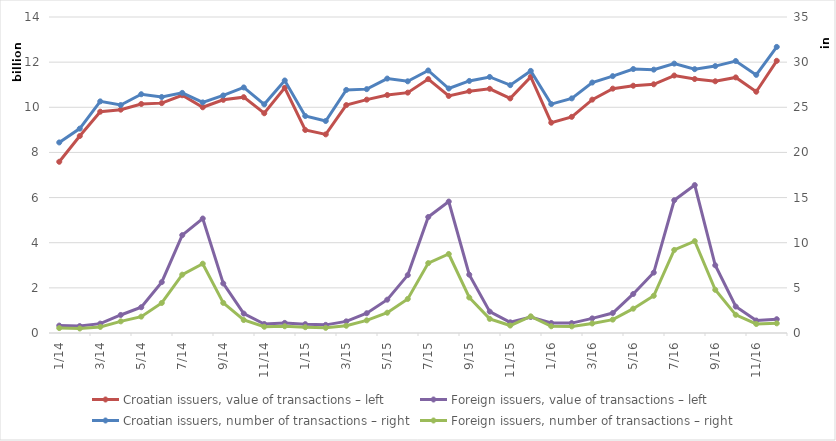
| Category | Croatian issuers, value of transactions – left | Foreign issuers, value of transactions – left |
|---|---|---|
| 2014-01-01 | 7585840375 | 328201810 |
| 2014-02-01 | 8725526927 | 306395645 |
| 2014-03-01 | 9804662078 | 415570803 |
| 2014-04-01 | 9894648498 | 798582111 |
| 2014-05-01 | 10147293016 | 1142027280 |
| 2014-06-01 | 10184003798 | 2253138744 |
| 2014-07-01 | 10533646343 | 4336828548 |
| 2014-08-01 | 10000321273 | 5071737877 |
| 2014-09-01 | 10330312901 | 2195141284 |
| 2014-10-01 | 10447253094 | 859794628 |
| 2014-11-01 | 9735255380 | 398467769 |
| 2014-12-01 | 10859944205 | 447230458 |
| 2015-01-01 | 8994025271 | 392887043 |
| 2015-02-01 | 8800036174 | 360578001 |
| 2015-03-01 | 10097058766 | 515915901 |
| 2015-04-01 | 10338785985 | 875908455 |
| 2015-05-01 | 10542688074 | 1476075593 |
| 2015-06-01 | 10649312994 | 2564850254 |
| 2015-07-01 | 11248842312 | 5138493752 |
| 2015-08-01 | 10502147963 | 5824208164 |
| 2015-09-01 | 10713265770 | 2584419239 |
| 2015-10-01 | 10819164689 | 946749241 |
| 2015-11-01 | 10393388690 | 473256061 |
| 2015-12-01 | 11345706350 | 710466353 |
| 2016-01-01 | 9317746815 | 441856028 |
| 2016-02-01 | 9576821038 | 438769379 |
| 2016-03-01 | 10339326725 | 647339028 |
| 2016-04-01 | 10825809318 | 884583155 |
| 2016-05-01 | 10955398175 | 1729494397 |
| 2016-06-01 | 11018977541 | 2676151777 |
| 2016-07-01 | 11407397299 | 5882317756 |
| 2016-08-01 | 11252543958 | 6552115285 |
| 2016-09-01 | 11152267687 | 3000126625 |
| 2016-10-01 | 11323295107 | 1172353982 |
| 2016-11-01 | 10690015167 | 552867564 |
| 2016-12-01 | 12058984612 | 610678340 |